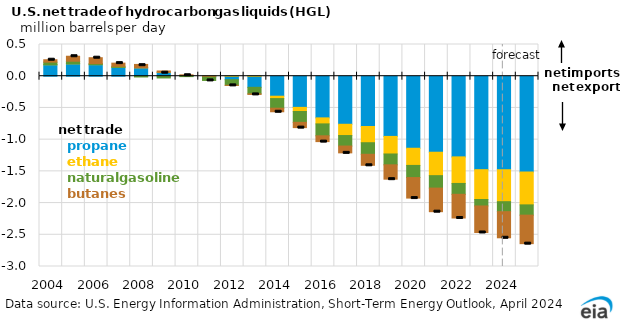
| Category | propane  | ethane | natural gasoline | butanes |
|---|---|---|---|---|
| 2004.0 | 0.181 | 0 | 0.04 | 0.038 |
| 2005.0 | 0.196 | 0.001 | 0.04 | 0.079 |
| 2006.0 | 0.182 | 0 | 0.016 | 0.093 |
| 2007.0 | 0.139 | 0 | 0.016 | 0.051 |
| 2008.0 | 0.132 | 0 | -0.012 | 0.053 |
| 2009.0 | 0.062 | 0 | -0.027 | 0.02 |
| 2010.0 | 0.012 | 0 | -0.006 | 0.009 |
| 2011.0 | -0.014 | 0 | -0.052 | 0 |
| 2012.0 | -0.055 | 0 | -0.089 | -0.001 |
| 2013.0 | -0.175 | 0 | -0.103 | -0.009 |
| 2014.0 | -0.315 | -0.038 | -0.152 | -0.056 |
| 2015.0 | -0.491 | -0.065 | -0.172 | -0.083 |
| 2016.0 | -0.657 | -0.095 | -0.188 | -0.091 |
| 2017.0 | -0.758 | -0.178 | -0.166 | -0.107 |
| 2018.0 | -0.793 | -0.256 | -0.183 | -0.174 |
| 2019.0 | -0.949 | -0.277 | -0.171 | -0.226 |
| 2020.0 | -1.136 | -0.271 | -0.192 | -0.323 |
| 2021.0 | -1.198 | -0.369 | -0.196 | -0.372 |
| 2022.0 | -1.272 | -0.419 | -0.171 | -0.373 |
| 2023.0 | -1.473 | -0.471 | -0.102 | -0.418 |
| 2024.0 | -1.474 | -0.504 | -0.157 | -0.412 |
| 2025.0 | -1.51 | -0.518 | -0.162 | -0.449 |